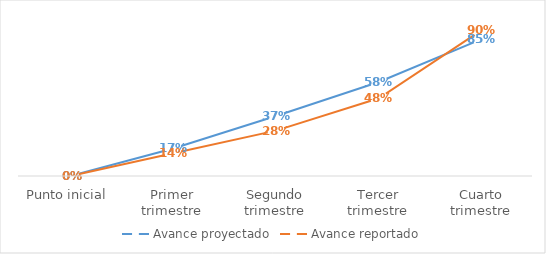
| Category | Avance proyectado | Avance reportado |
|---|---|---|
| Punto inicial | 0 | 0 |
| Primer trimestre | 0.17 | 0.14 |
| Segundo trimestre | 0.37 | 0.28 |
| Tercer trimestre | 0.58 | 0.48 |
| Cuarto trimestre | 0.845 | 0.9 |